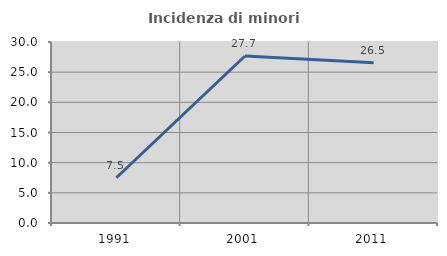
| Category | Incidenza di minori stranieri |
|---|---|
| 1991.0 | 7.5 |
| 2001.0 | 27.679 |
| 2011.0 | 26.545 |